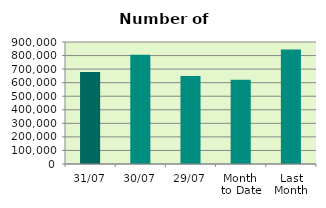
| Category | Series 0 |
|---|---|
| 31/07 | 679054 |
| 30/07 | 805878 |
| 29/07 | 648510 |
| Month 
to Date | 622411.826 |
| Last
Month | 844726.818 |